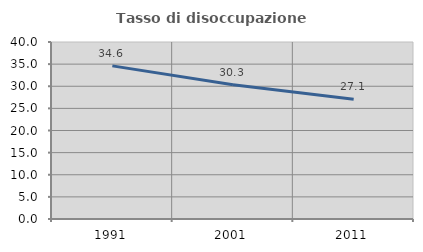
| Category | Tasso di disoccupazione giovanile  |
|---|---|
| 1991.0 | 34.606 |
| 2001.0 | 30.317 |
| 2011.0 | 27.083 |